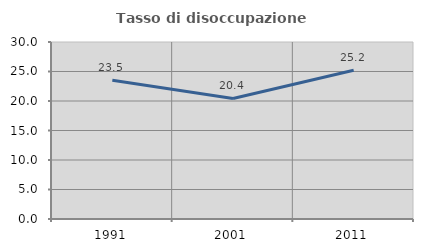
| Category | Tasso di disoccupazione giovanile  |
|---|---|
| 1991.0 | 23.529 |
| 2001.0 | 20.438 |
| 2011.0 | 25.225 |